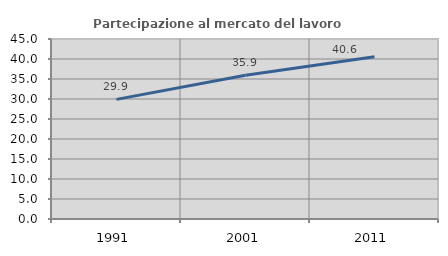
| Category | Partecipazione al mercato del lavoro  femminile |
|---|---|
| 1991.0 | 29.909 |
| 2001.0 | 35.934 |
| 2011.0 | 40.577 |